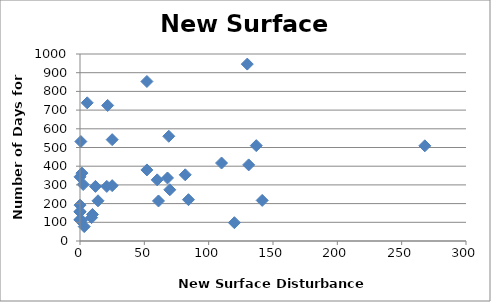
| Category | Series 0 |
|---|---|
| 0.0 | 343 |
| 52.0 | 380 |
| 0.0 | 115 |
| 120.0 | 98 |
| 8470.0 | 406 |
| 25.0 | 296 |
| 130.0 | 946 |
| 3530.0 | 336 |
| 61.0 | 214 |
| 84.3 | 221 |
| 137.0 | 510 |
| 141.6 | 217 |
| 12.0 | 292 |
| 1.5 | 363 |
| 0.0 | 155 |
| 0.0 | 192 |
| 52.0 | 853 |
| 69.79 | 274 |
| 1.2 | 111 |
| 3.3 | 77 |
| 69.0 | 560 |
| 68.0 | 337 |
| 25.0 | 542 |
| 9.0 | 125 |
| 81.8 | 354 |
| 268.0 | 509 |
| 2.5 | 302 |
| 0.66 | 532 |
| 620.0 | 327 |
| 110.0 | 417 |
| 60.0 | 327 |
| 14.0 | 215 |
| 9.68 | 142 |
| 0.0 | 158 |
| 21.5 | 725 |
| 5.6 | 739 |
| 20.84 | 292 |
| 0.0 | 112 |
| 131.1 | 407 |